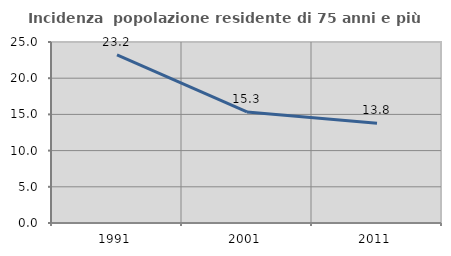
| Category | Incidenza  popolazione residente di 75 anni e più |
|---|---|
| 1991.0 | 23.235 |
| 2001.0 | 15.339 |
| 2011.0 | 13.772 |